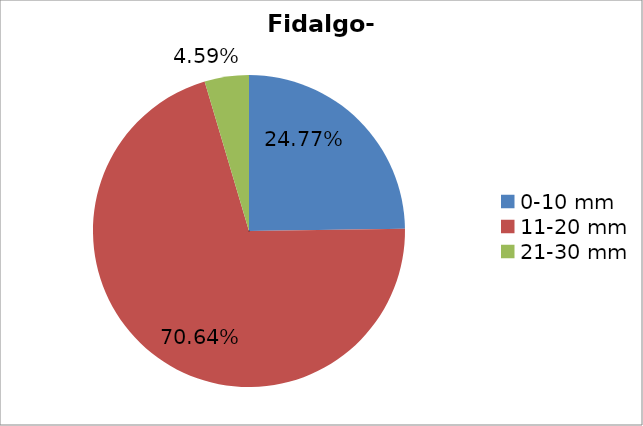
| Category | Series 0 |
|---|---|
| 0-10 mm | 0.248 |
| 11-20 mm | 0.706 |
| 21-30 mm | 0.046 |